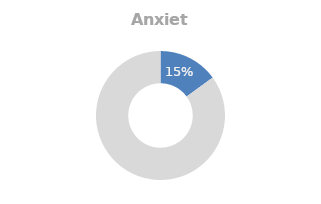
| Category | Anxiety |
|---|---|
| 0 | 0.15 |
| 1 | 0.85 |